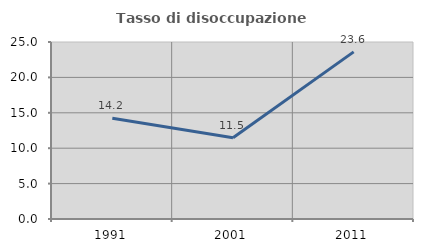
| Category | Tasso di disoccupazione giovanile  |
|---|---|
| 1991.0 | 14.235 |
| 2001.0 | 11.472 |
| 2011.0 | 23.605 |